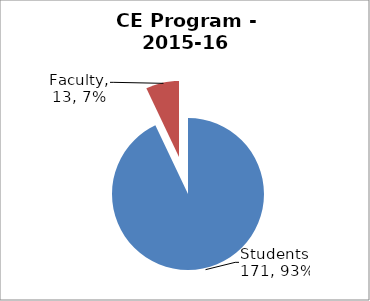
| Category | Series 0 |
|---|---|
| Students | 171 |
| Faculty | 13 |